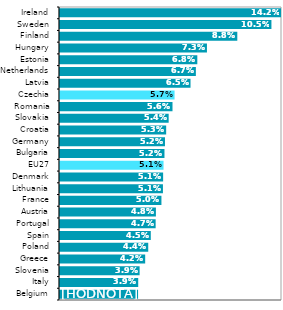
| Category | Series 0 |
|---|---|
| Belgium | 0.039 |
| Italy | 0.039 |
| Slovenia | 0.039 |
| Greece | 0.042 |
| Poland | 0.044 |
| Spain | 0.045 |
| Portugal | 0.047 |
| Austria | 0.048 |
| France | 0.05 |
| Lithuania | 0.051 |
| Denmark | 0.051 |
| EU27 | 0.051 |
| Bulgaria | 0.052 |
| Germany | 0.052 |
| Croatia | 0.053 |
| Slovakia | 0.054 |
| Romania | 0.056 |
| Czechia | 0.057 |
| Latvia | 0.065 |
| Netherlands | 0.067 |
| Estonia | 0.068 |
| Hungary | 0.073 |
| Finland | 0.088 |
| Sweden | 0.105 |
| Ireland | 0.142 |